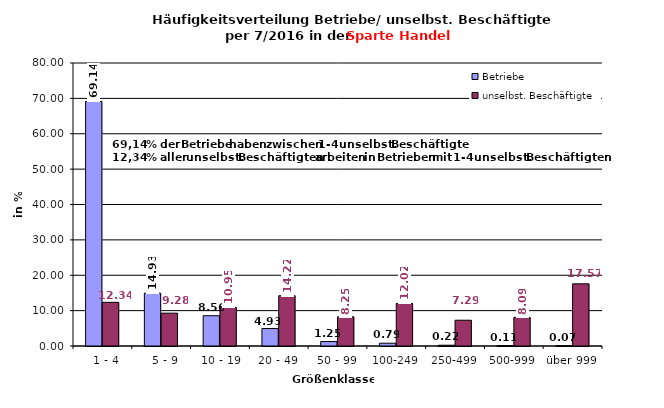
| Category | Betriebe | unselbst. Beschäftigte |
|---|---|---|
|   1 - 4 | 69.137 | 12.339 |
|   5 - 9 | 14.932 | 9.281 |
|  10 - 19 | 8.56 | 10.954 |
| 20 - 49 | 4.93 | 14.217 |
| 50 - 99 | 1.25 | 8.248 |
| 100-249 | 0.786 | 12.015 |
| 250-499 | 0.222 | 7.285 |
| 500-999 | 0.111 | 8.087 |
| über 999 | 0.071 | 17.574 |